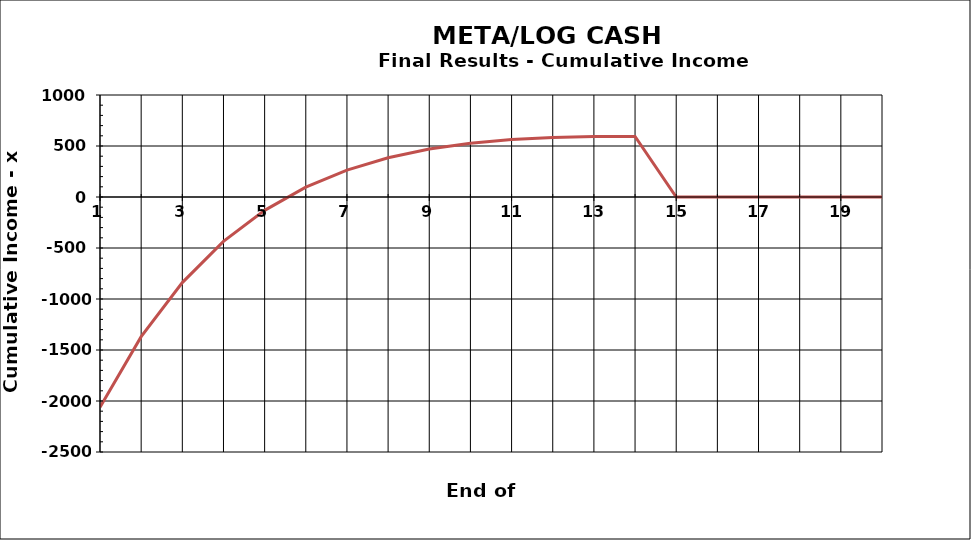
| Category | Series 1 |
|---|---|
| nan | -2957.833 |
| 1.0 | -2061.145 |
| 2.0 | -1369.564 |
| 3.0 | -839.236 |
| 4.0 | -435.426 |
| 5.0 | -130.642 |
| 6.0 | 96.856 |
| 7.0 | 264.232 |
| 8.0 | 385.029 |
| 9.0 | 469.909 |
| 10.0 | 527.255 |
| 11.0 | 563.643 |
| 12.0 | 584.22 |
| 13.0 | 593.002 |
| 14.0 | 593.114 |
| 15.0 | 0 |
| 16.0 | 0 |
| 17.0 | 0 |
| 18.0 | 0 |
| 19.0 | 0 |
| 20.0 | 0 |